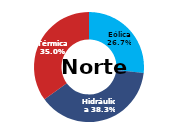
| Category | Norte |
|---|---|
| Eólica | 82.97 |
| Hidráulica | 118.706 |
| Solar | 0 |
| Térmica | 108.607 |